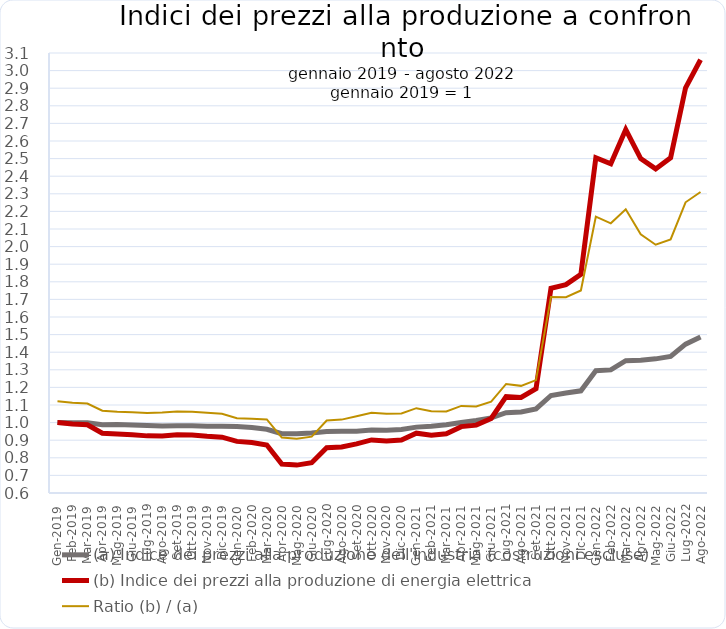
| Category | (a) Indice dei prezzi alla produzione dell'industria (costruzioni escluse) | (b) Indice dei prezzi alla produzione di energia elettrica | Ratio (b) / (a) |
|---|---|---|---|
| Gen-2019 | 1 | 1 | 1.122 |
| Feb-2019 | 0.999 | 0.992 | 1.113 |
| Mar-2019 | 0.999 | 0.987 | 1.108 |
| Apr-2019 | 0.988 | 0.94 | 1.067 |
| Mag-2019 | 0.989 | 0.936 | 1.062 |
| Giu-2019 | 0.986 | 0.931 | 1.059 |
| Lug-2019 | 0.984 | 0.925 | 1.054 |
| Ago-2019 | 0.98 | 0.924 | 1.057 |
| Set-2019 | 0.982 | 0.931 | 1.063 |
| Ott-2019 | 0.982 | 0.93 | 1.062 |
| Nov-2019 | 0.979 | 0.922 | 1.056 |
| Dic-2019 | 0.979 | 0.917 | 1.05 |
| Gen-2020 | 0.977 | 0.893 | 1.025 |
| Feb-2020 | 0.972 | 0.886 | 1.022 |
| Mar-2020 | 0.962 | 0.873 | 1.018 |
| Apr-2020 | 0.937 | 0.764 | 0.915 |
| Mag-2020 | 0.936 | 0.758 | 0.909 |
| Giu-2020 | 0.941 | 0.772 | 0.92 |
| Lug-2020 | 0.95 | 0.857 | 1.012 |
| Ago-2020 | 0.951 | 0.862 | 1.017 |
| Set-2020 | 0.952 | 0.879 | 1.036 |
| Ott-2020 | 0.958 | 0.902 | 1.056 |
| Nov-2020 | 0.956 | 0.896 | 1.051 |
| Dic-2020 | 0.961 | 0.901 | 1.051 |
| Gen-2021 | 0.974 | 0.94 | 1.082 |
| Feb-2021 | 0.979 | 0.929 | 1.064 |
| Mar-2021 | 0.988 | 0.936 | 1.064 |
| Apr-2021 | 1.001 | 0.977 | 1.095 |
| Mag-2021 | 1.012 | 0.986 | 1.092 |
| Giu-2021 | 1.027 | 1.024 | 1.119 |
| Lug-2021 | 1.056 | 1.148 | 1.22 |
| Ago-2021 | 1.061 | 1.143 | 1.209 |
| Set-2021 | 1.078 | 1.193 | 1.242 |
| Ott-2021 | 1.154 | 1.764 | 1.714 |
| Nov-2021 | 1.168 | 1.784 | 1.713 |
| Dic-2021 | 1.181 | 1.842 | 1.75 |
| Gen-2022 | 1.295 | 2.505 | 2.17 |
| Feb-2022 | 1.299 | 2.47 | 2.132 |
| Mar-2022 | 1.352 | 2.665 | 2.212 |
| Apr-2022 | 1.355 | 2.5 | 2.07 |
| Mag-2022 | 1.362 | 2.442 | 2.01 |
| Giu-2022 | 1.376 | 2.504 | 2.041 |
| Lug-2022 | 1.446 | 2.903 | 2.252 |
| Ago-2022 | 1.487 | 3.062 | 2.31 |